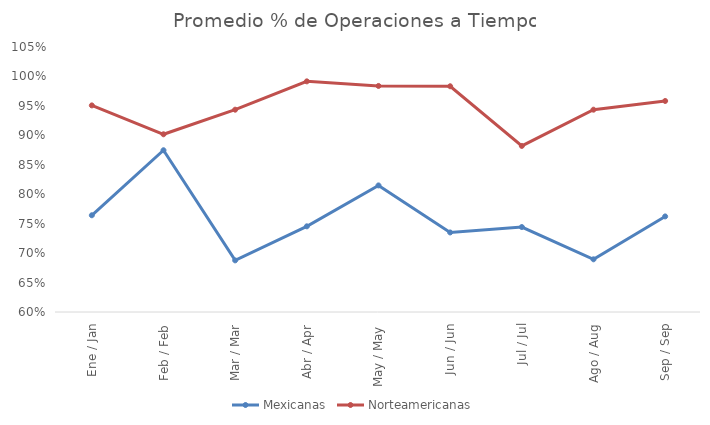
| Category | Mexicanas | Norteamericanas |
|---|---|---|
| Ene / Jan | 0.764 | 0.951 |
| Feb / Feb | 0.875 | 0.902 |
| Mar / Mar | 0.688 | 0.944 |
| Abr / Apr | 0.745 | 0.992 |
| May / May | 0.815 | 0.984 |
| Jun / Jun | 0.735 | 0.983 |
| Jul / Jul | 0.744 | 0.882 |
| Ago / Aug | 0.689 | 0.944 |
| Sep / Sep | 0.762 | 0.958 |